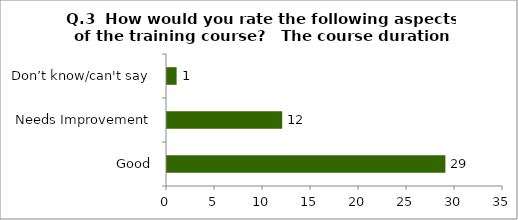
| Category | Q.3  How would you rate the following aspects of the training course?  |
|---|---|
| Good | 29 |
| Needs Improvement | 12 |
| Don’t know/can't say | 1 |